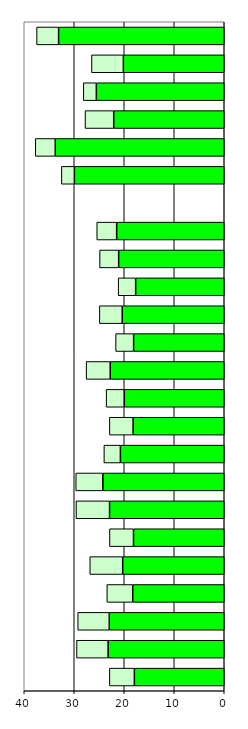
| Category | Series 0 | Series 1 |
|---|---|---|
| 0 | 17.976 | 4.993 |
| 1 | 23.228 | 6.316 |
| 2 | 23 | 6.307 |
| 3 | 18.302 | 5.178 |
| 4 | 20.309 | 6.582 |
| 5 | 18.151 | 4.805 |
| 6 | 22.942 | 6.712 |
| 7 | 24.278 | 5.426 |
| 8 | 20.77 | 3.304 |
| 9 | 18.233 | 4.738 |
| 10 | 20.007 | 3.618 |
| 11 | 22.804 | 4.822 |
| 12 | 18.131 | 3.6 |
| 13 | 20.406 | 4.567 |
| 14 | 17.72 | 3.495 |
| 15 | 21.116 | 3.818 |
| 16 | 21.518 | 3.985 |
| 17 | 0 | 0 |
| 18 | 29.974 | 2.596 |
| 19 | 33.799 | 3.994 |
| 20 | 22.104 | 5.741 |
| 21 | 25.582 | 2.603 |
| 22 | 20.18 | 6.373 |
| 23 | 33.131 | 4.399 |